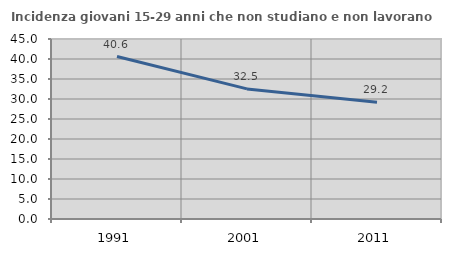
| Category | Incidenza giovani 15-29 anni che non studiano e non lavorano  |
|---|---|
| 1991.0 | 40.614 |
| 2001.0 | 32.52 |
| 2011.0 | 29.167 |